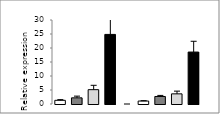
| Category | Series 0 |
|---|---|
|  - | 1.313 |
| HC | 2.203 |